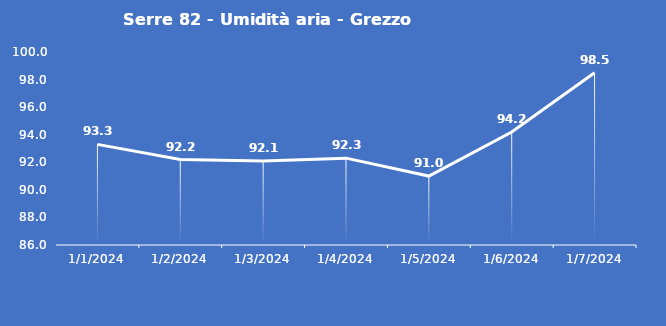
| Category | Serre 82 - Umidità aria - Grezzo (%) |
|---|---|
| 1/1/24 | 93.3 |
| 1/2/24 | 92.2 |
| 1/3/24 | 92.1 |
| 1/4/24 | 92.3 |
| 1/5/24 | 91 |
| 1/6/24 | 94.2 |
| 1/7/24 | 98.5 |